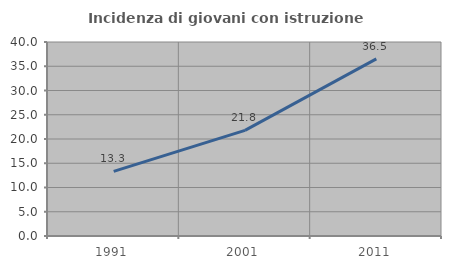
| Category | Incidenza di giovani con istruzione universitaria |
|---|---|
| 1991.0 | 13.333 |
| 2001.0 | 21.782 |
| 2011.0 | 36.508 |